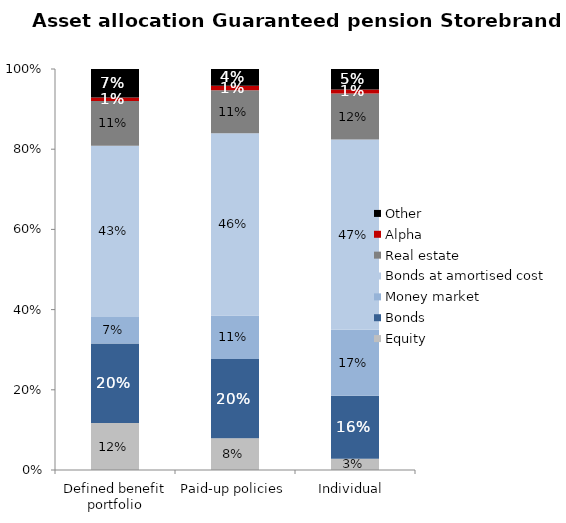
| Category | Equity | Bonds | Money market | Bonds at amortised cost | Real estate | Alpha | Other |
|---|---|---|---|---|---|---|---|
| Defined benefit portfolio | 0.117 | 0.198 | 0.066 | 0.427 | 0.111 | 0.009 | 0.071 |
| Paid-up policies | 0.079 | 0.198 | 0.108 | 0.455 | 0.107 | 0.011 | 0.042 |
| Individual  | 0.028 | 0.157 | 0.165 | 0.474 | 0.115 | 0.01 | 0.051 |